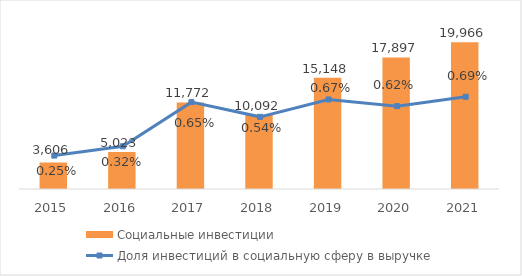
| Category | Социальные инвестиции |
|---|---|
| 2015.0 | 3606 |
| 2016.0 | 5023 |
| 2017.0 | 11772 |
| 2018.0 | 10092.129 |
| 2019.0 | 15148.373 |
| 2020.0 | 17897.476 |
| 2021.0 | 19965.927 |